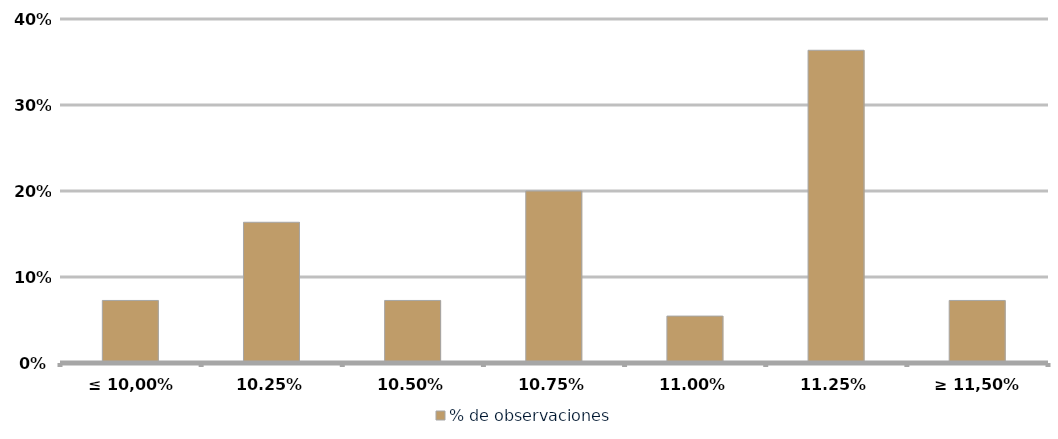
| Category | % de observaciones  |
|---|---|
| ≤ 10,00% | 0.073 |
| 10,25% | 0.164 |
| 10,50% | 0.073 |
| 10,75% | 0.2 |
| 11,00% | 0.055 |
| 11,25% | 0.364 |
| ≥ 11,50% | 0.073 |